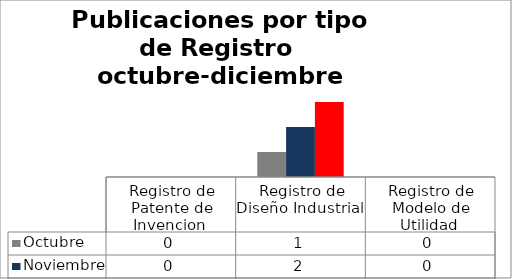
| Category | Octubre | Noviembre | Diciembre |
|---|---|---|---|
| Registro de Patente de Invencion  | 0 | 0 | 0 |
| Registro de Diseño Industrial  | 1 | 2 | 3 |
| Registro de Modelo de Utilidad  | 0 | 0 | 0 |